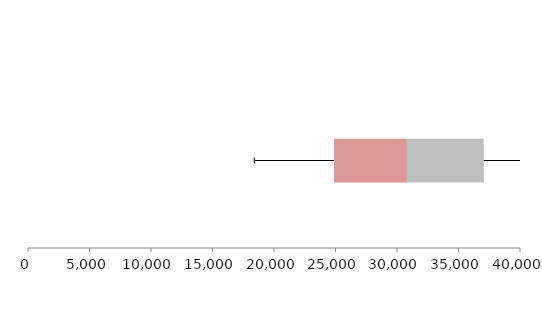
| Category | Series 1 | Series 2 | Series 3 |
|---|---|---|---|
| 0 | 24887.254 | 5915.407 | 6248.761 |